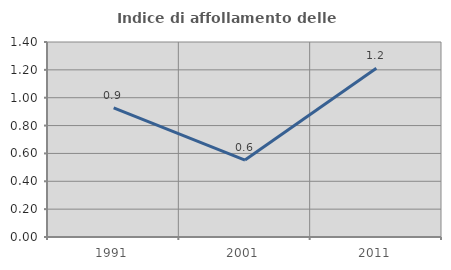
| Category | Indice di affollamento delle abitazioni  |
|---|---|
| 1991.0 | 0.927 |
| 2001.0 | 0.552 |
| 2011.0 | 1.211 |